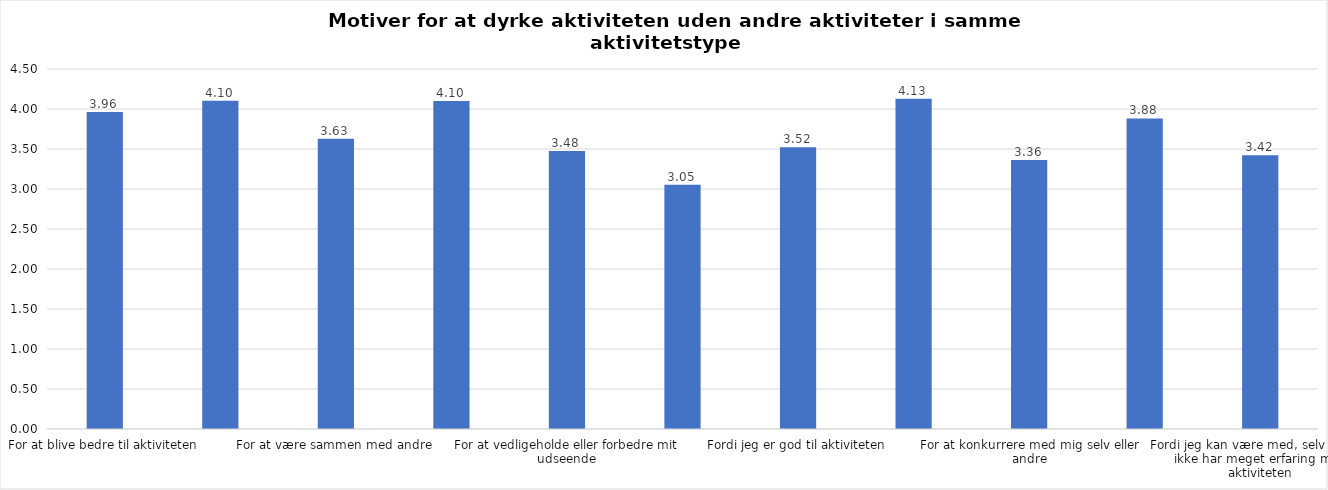
| Category | Gennemsnit |
|---|---|
| For at blive bedre til aktiviteten | 3.964 |
| For at vedligeholde eller forbedre min sundhed (fx helbred, fysisk form) | 4.104 |
| For at være sammen med andre | 3.629 |
| For at gøre noget godt for mig selv | 4.1 |
| For at vedligeholde eller forbedre mit udseende | 3.475 |
| Fordi andre i min omgangskreds opmuntrer mig til det | 3.054 |
| Fordi jeg er god til aktiviteten | 3.52 |
| Fordi jeg godt kan lide aktiviteten | 4.127 |
| For at konkurrere med mig selv eller andre | 3.362 |
| Fordi aktiviteten passer godt ind i min hverdag | 3.882 |
| Fordi jeg kan være med, selv om jeg ikke har meget erfaring med aktiviteten | 3.423 |